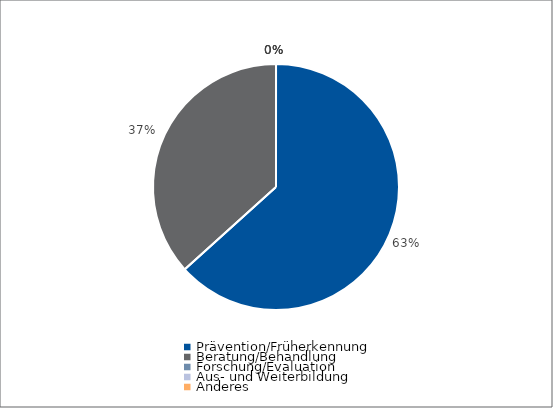
| Category | Series 0 |
|---|---|
| Prävention/Früherkennung | 10355 |
| Beratung/Behandlung | 6000 |
| Forschung/Evaluation | 0 |
| Aus- und Weiterbildung | 0 |
| Anderes | 0 |